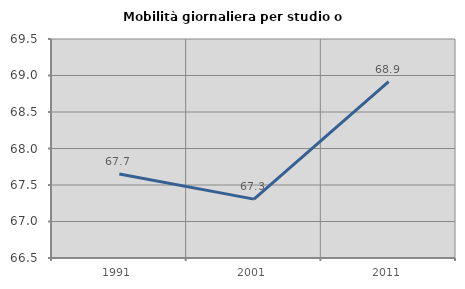
| Category | Mobilità giornaliera per studio o lavoro |
|---|---|
| 1991.0 | 67.65 |
| 2001.0 | 67.306 |
| 2011.0 | 68.916 |